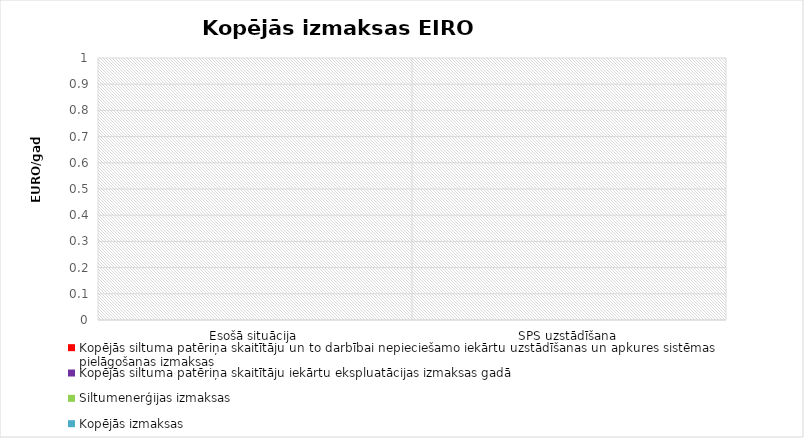
| Category | Kopējās siltuma patēriņa skaitītāju un to darbībai nepieciešamo iekārtu uzstādīšanas un apkures sistēmas pielāgošanas izmaksas  | Kopējās siltuma patēriņa skaitītāju iekārtu ekspluatācijas izmaksas gadā | Siltumenerģijas izmaksas | Kopējās izmaksas |
|---|---|---|---|---|
| Esošā situācija | 0 | 0 | 0 | 0 |
| SPS uzstādīšana | 0 | 0 | 0 | 0 |